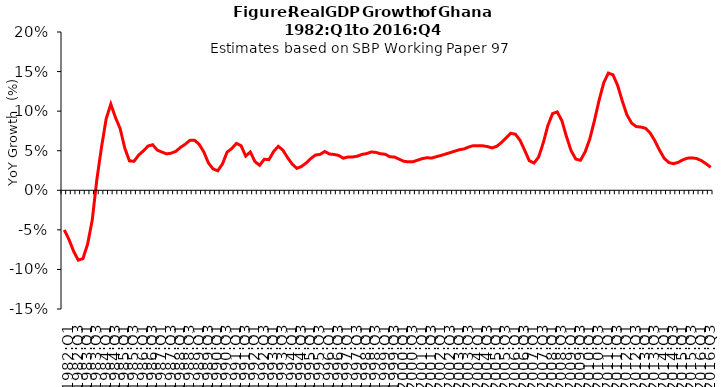
| Category | Series 0 |
|---|---|
| 1982:Q1 | -0.05 |
| 1982:Q2 | -0.062 |
| 1982:Q3 | -0.077 |
| 1982:Q4 | -0.088 |
| 1983:Q1 | -0.086 |
| 1983:Q2 | -0.068 |
| 1983:Q3 | -0.038 |
| 1983:Q4 | 0.014 |
| 1984:Q1 | 0.055 |
| 1984:Q2 | 0.09 |
| 1984:Q3 | 0.109 |
| 1984:Q4 | 0.092 |
| 1985:Q1 | 0.078 |
| 1985:Q2 | 0.053 |
| 1985:Q3 | 0.037 |
| 1985:Q4 | 0.037 |
| 1986:Q1 | 0.045 |
| 1986:Q2 | 0.05 |
| 1986:Q3 | 0.056 |
| 1986:Q4 | 0.058 |
| 1987:Q1 | 0.051 |
| 1987:Q2 | 0.048 |
| 1987:Q3 | 0.046 |
| 1987:Q4 | 0.047 |
| 1988:Q1 | 0.049 |
| 1988:Q2 | 0.054 |
| 1988:Q3 | 0.058 |
| 1988:Q4 | 0.063 |
| 1989:Q1 | 0.063 |
| 1989:Q2 | 0.058 |
| 1989:Q3 | 0.048 |
| 1989:Q4 | 0.034 |
| 1990:Q1 | 0.027 |
| 1990:Q2 | 0.025 |
| 1990:Q3 | 0.033 |
| 1990:Q4 | 0.048 |
| 1991:Q1 | 0.053 |
| 1991:Q2 | 0.059 |
| 1991:Q3 | 0.056 |
| 1991:Q4 | 0.043 |
| 1992:Q1 | 0.048 |
| 1992:Q2 | 0.036 |
| 1992:Q3 | 0.032 |
| 1992:Q4 | 0.039 |
| 1993:Q1 | 0.039 |
| 1993:Q2 | 0.049 |
| 1993:Q3 | 0.056 |
| 1993:Q4 | 0.051 |
| 1994:Q1 | 0.041 |
| 1994:Q2 | 0.033 |
| 1994:Q3 | 0.028 |
| 1994:Q4 | 0.03 |
| 1995:Q1 | 0.034 |
| 1995:Q2 | 0.04 |
| 1995:Q3 | 0.045 |
| 1995:Q4 | 0.045 |
| 1996:Q1 | 0.049 |
| 1996:Q2 | 0.046 |
| 1996:Q3 | 0.045 |
| 1996:Q4 | 0.044 |
| 1997:Q1 | 0.041 |
| 1997:Q2 | 0.042 |
| 1997:Q3 | 0.042 |
| 1997:Q4 | 0.043 |
| 1998:Q1 | 0.045 |
| 1998:Q2 | 0.046 |
| 1998:Q3 | 0.048 |
| 1998:Q4 | 0.048 |
| 1999:Q1 | 0.046 |
| 1999:Q2 | 0.046 |
| 1999:Q3 | 0.042 |
| 1999:Q4 | 0.042 |
| 2000:Q1 | 0.039 |
| 2000:Q2 | 0.037 |
| 2000:Q3 | 0.036 |
| 2000:Q4 | 0.036 |
| 2001:Q1 | 0.038 |
| 2001:Q2 | 0.04 |
| 2001:Q3 | 0.041 |
| 2001:Q4 | 0.041 |
| 2002:Q1 | 0.042 |
| 2002:Q2 | 0.044 |
| 2002:Q3 | 0.046 |
| 2002:Q4 | 0.048 |
| 2003:Q1 | 0.05 |
| 2003:Q2 | 0.051 |
| 2003:Q3 | 0.052 |
| 2003:Q4 | 0.055 |
| 2004:Q1 | 0.056 |
| 2004:Q2 | 0.056 |
| 2004:Q3 | 0.056 |
| 2004:Q4 | 0.055 |
| 2005:Q1 | 0.054 |
| 2005:Q2 | 0.056 |
| 2005:Q3 | 0.06 |
| 2005:Q4 | 0.066 |
| 2006:Q1 | 0.072 |
| 2006:Q2 | 0.071 |
| 2006:Q3 | 0.063 |
| 2006:Q4 | 0.051 |
| 2007:Q1 | 0.037 |
| 2007:Q2 | 0.034 |
| 2007:Q3 | 0.042 |
| 2007:Q4 | 0.06 |
| 2008:Q1 | 0.082 |
| 2008:Q2 | 0.097 |
| 2008:Q3 | 0.099 |
| 2008:Q4 | 0.088 |
| 2009:Q1 | 0.068 |
| 2009:Q2 | 0.05 |
| 2009:Q3 | 0.039 |
| 2009:Q4 | 0.038 |
| 2010:Q1 | 0.049 |
| 2010:Q2 | 0.065 |
| 2010:Q3 | 0.088 |
| 2010:Q4 | 0.114 |
| 2011:Q1 | 0.136 |
| 2011:Q2 | 0.148 |
| 2011:Q3 | 0.146 |
| 2011:Q4 | 0.132 |
| 2012:Q1 | 0.113 |
| 2012:Q2 | 0.095 |
| 2012:Q3 | 0.085 |
| 2012:Q4 | 0.081 |
| 2013:Q1 | 0.08 |
| 2013:Q2 | 0.078 |
| 2013:Q3 | 0.072 |
| 2013:Q4 | 0.063 |
| 2014:Q1 | 0.051 |
| 2014:Q2 | 0.041 |
| 2014:Q3 | 0.035 |
| 2014:Q4 | 0.034 |
| 2015:Q1 | 0.035 |
| 2015:Q2 | 0.038 |
| 2015:Q3 | 0.041 |
| 2015:Q4 | 0.041 |
| 2016:Q1 | 0.04 |
| 2016:Q2 | 0.037 |
| 2016:Q3 | 0.034 |
| 2016:Q4 | 0.029 |